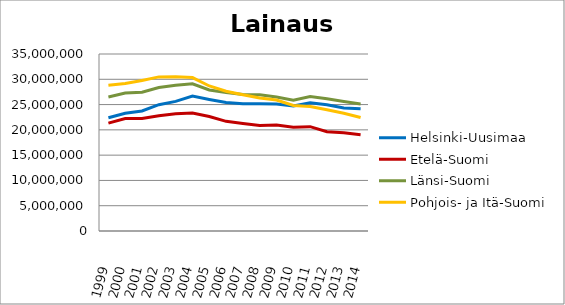
| Category | Helsinki-Uusimaa | Etelä-Suomi | Länsi-Suomi | Pohjois- ja Itä-Suomi |
|---|---|---|---|---|
| 1999.0 | 22404754 | 21330651 | 26499621 | 28818500 |
| 2000.0 | 23298218 | 22252262 | 27267624 | 29153371 |
| 2001.0 | 23739838 | 22229200 | 27457746 | 29776000 |
| 2002.0 | 24981623 | 22794984 | 28357637 | 30473942 |
| 2003.0 | 25637350 | 23164944 | 28825819 | 30523221 |
| 2004.0 | 26671223 | 23334827 | 29095793 | 30339457 |
| 2005.0 | 26015750 | 22638652 | 27882571 | 28678414 |
| 2006.0 | 25429844 | 21685123 | 27386764 | 27646972 |
| 2007.0 | 25163387 | 21271360 | 27015156 | 26936296 |
| 2008.0 | 25146308 | 20860039 | 26950641 | 26302803 |
| 2009.0 | 25102250 | 20938398 | 26489138 | 25887545 |
| 2010.0 | 24742752 | 20533586 | 25869940 | 24821851 |
| 2011.0 | 25370942 | 20631852 | 26580118 | 24617735 |
| 2012.0 | 24958904 | 19638421 | 26134397 | 23991214 |
| 2013.0 | 24314792 | 19419295 | 25609060 | 23282968 |
| 2014.0 | 24172574 | 19029588 | 25092971 | 22435916 |